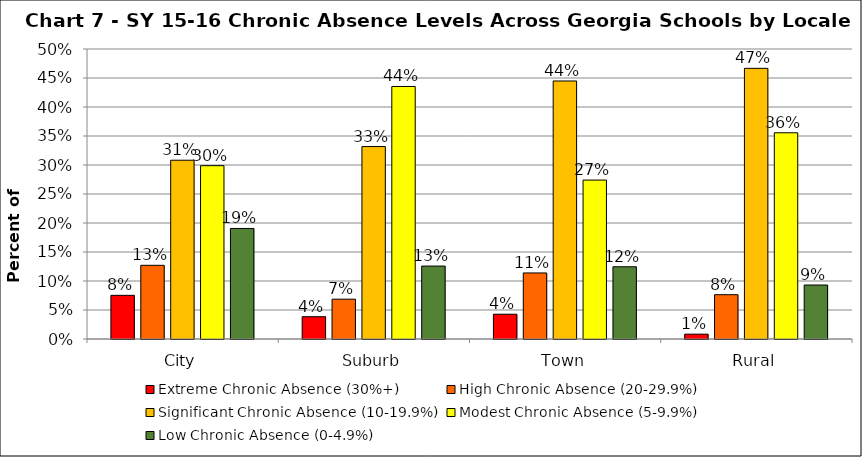
| Category | Extreme Chronic Absence (30%+) | High Chronic Absence (20-29.9%) | Significant Chronic Absence (10-19.9%) | Modest Chronic Absence (5-9.9%) | Low Chronic Absence (0-4.9%) |
|---|---|---|---|---|---|
| 0 | 0.075 | 0.127 | 0.308 | 0.299 | 0.191 |
| 1 | 0.038 | 0.069 | 0.332 | 0.435 | 0.126 |
| 2 | 0.043 | 0.114 | 0.445 | 0.274 | 0.125 |
| 3 | 0.008 | 0.076 | 0.467 | 0.356 | 0.093 |